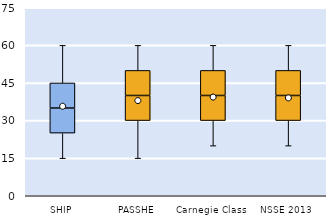
| Category | 25th | 50th | 75th |
|---|---|---|---|
| SHIP | 25 | 10 | 10 |
| PASSHE | 30 | 10 | 10 |
| Carnegie Class | 30 | 10 | 10 |
| NSSE 2013 | 30 | 10 | 10 |